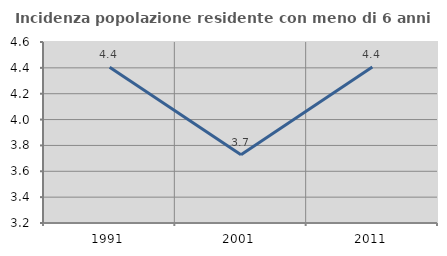
| Category | Incidenza popolazione residente con meno di 6 anni |
|---|---|
| 1991.0 | 4.405 |
| 2001.0 | 3.728 |
| 2011.0 | 4.406 |